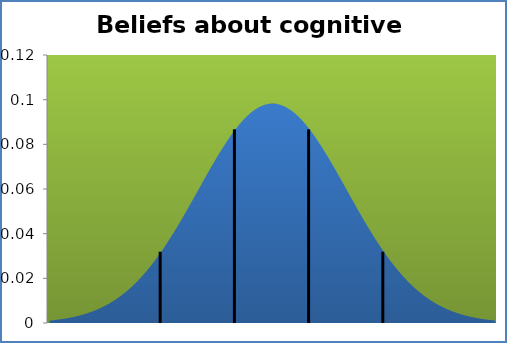
| Category | Series 1 |
|---|---|
| -2.669999999999998 | 0.001 |
| -2.4669999999999987 | 0.001 |
| -2.2639999999999993 | 0.001 |
| -2.061 | 0.002 |
| -1.8579999999999988 | 0.002 |
| -1.6549999999999994 | 0.002 |
| -1.452 | 0.003 |
| -1.2489999999999988 | 0.003 |
| -1.0459999999999994 | 0.003 |
| -0.8429999999999982 | 0.004 |
| -0.6399999999999988 | 0.004 |
| -0.4369999999999994 | 0.005 |
| -0.23399999999999999 | 0.006 |
| -0.031000000000000583 | 0.006 |
| 0.1720000000000006 | 0.007 |
| 0.375 | 0.008 |
| 0.5780000000000012 | 0.009 |
| 0.7810000000000006 | 0.01 |
| 0.984 | 0.011 |
| 1.1870000000000012 | 0.012 |
| 1.3900000000000006 | 0.013 |
| 1.5930000000000009 | 0.015 |
| 1.7960000000000012 | 0.016 |
| 1.9989999999999997 | 0.018 |
| 2.202 | 0.019 |
| 2.4050000000000002 | 0.021 |
| 2.6080000000000005 | 0.023 |
| 2.811 | 0.025 |
| 3.0140000000000002 | 0.027 |
| 3.2170000000000005 | 0.03 |
| 3.420000000000001 | 0.032 |
| 3.623 | 0.034 |
| 3.8260000000000005 | 0.037 |
| 4.029 | 0.04 |
| 4.232 | 0.042 |
| 4.4350000000000005 | 0.045 |
| 4.638 | 0.048 |
| 4.841 | 0.051 |
| 5.0440000000000005 | 0.054 |
| 5.247 | 0.057 |
| 5.45 | 0.06 |
| 5.6530000000000005 | 0.063 |
| 5.856 | 0.066 |
| 6.059 | 0.068 |
| 6.2620000000000005 | 0.071 |
| 6.465 | 0.074 |
| 6.668 | 0.077 |
| 6.871 | 0.08 |
| 7.074 | 0.082 |
| 7.277 | 0.084 |
| 7.48 | 0.087 |
| 7.683 | 0.089 |
| 7.886 | 0.091 |
| 8.089 | 0.092 |
| 8.292 | 0.094 |
| 8.495 | 0.095 |
| 8.698 | 0.096 |
| 8.901 | 0.097 |
| 9.104 | 0.098 |
| 9.307 | 0.098 |
| 9.51 | 0.098 |
| 9.713 | 0.098 |
| 9.916 | 0.098 |
| 10.119 | 0.097 |
| 10.322 | 0.096 |
| 10.525 | 0.095 |
| 10.728 | 0.094 |
| 10.931 | 0.092 |
| 11.134 | 0.091 |
| 11.337 | 0.089 |
| 11.54 | 0.087 |
| 11.742999999999999 | 0.084 |
| 11.946 | 0.082 |
| 12.149 | 0.08 |
| 12.352 | 0.077 |
| 12.555 | 0.074 |
| 12.758 | 0.071 |
| 12.960999999999999 | 0.068 |
| 13.164 | 0.066 |
| 13.366999999999999 | 0.063 |
| 13.57 | 0.06 |
| 13.773 | 0.057 |
| 13.975999999999999 | 0.054 |
| 14.178999999999998 | 0.051 |
| 14.382 | 0.048 |
| 14.584999999999999 | 0.045 |
| 14.788 | 0.042 |
| 14.991 | 0.04 |
| 15.193999999999999 | 0.037 |
| 15.396999999999998 | 0.034 |
| 15.599999999999998 | 0.032 |
| 15.802999999999999 | 0.03 |
| 16.006 | 0.027 |
| 16.209 | 0.025 |
| 16.412 | 0.023 |
| 16.615 | 0.021 |
| 16.817999999999998 | 0.019 |
| 17.021 | 0.018 |
| 17.223999999999997 | 0.016 |
| 17.427 | 0.015 |
| 17.63 | 0.013 |
| 17.833 | 0.012 |
| 18.036 | 0.011 |
| 18.238999999999997 | 0.01 |
| 18.442 | 0.009 |
| 18.645 | 0.008 |
| 18.848 | 0.007 |
| 19.051000000000002 | 0.006 |
| 19.253999999999998 | 0.006 |
| 19.457 | 0.005 |
| 19.659999999999997 | 0.004 |
| 19.863 | 0.004 |
| 20.066 | 0.003 |
| 20.269 | 0.003 |
| 20.472 | 0.003 |
| 20.674999999999997 | 0.002 |
| 20.878 | 0.002 |
| 21.081 | 0.002 |
| 21.284 | 0.001 |
| 21.487 | 0.001 |
| 21.689999999999998 | 0.001 |